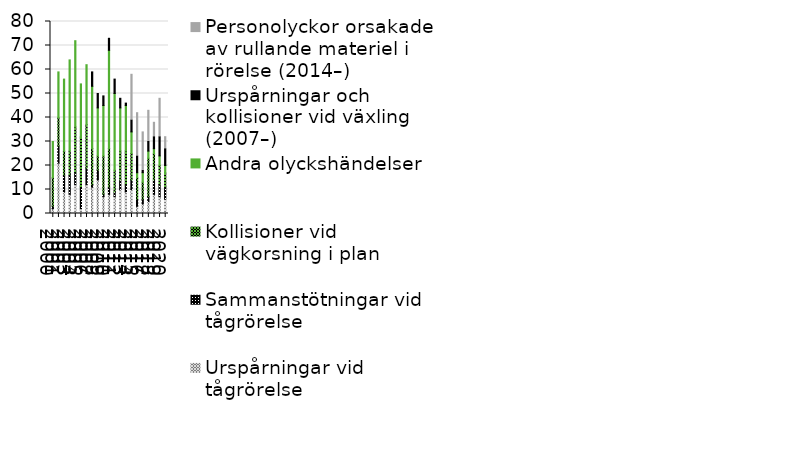
| Category | Urspårningar vid tågrörelse  | Sammanstötningar vid tågrörelse  | Kollisioner vid vägkorsning i plan | Andra olyckshändelser | Urspårningar och kollisioner vid växling  (2007–) | Personolyckor orsakade av rullande materiel i rörelse (2014–) |
|---|---|---|---|---|---|---|
| 2000 | 2 | 1 | 12 | 15 | 0 | 0 |
| 2001 | 21 | 7 | 12 | 19 | 0 | 0 |
| 2002 | 9 | 7 | 10 | 30 | 0 | 0 |
| 2003 | 8 | 8 | 10 | 38 | 0 | 0 |
| 2004 | 12 | 5 | 19 | 36 | 0 | 0 |
| 2005 | 2 | 9 | 21 | 22 | 0 | 0 |
| 2006 | 12 | 7 | 18 | 25 | 0 | 0 |
| 2007 | 11 | 1 | 15 | 26 | 6 | 0 |
| 2008 | 14 | 4 | 6 | 20 | 6 | 0 |
| 2009 | 7 | 1 | 16 | 21 | 4 | 0 |
| 2010 | 8 | 3 | 16 | 41 | 5 | 0 |
| 2011 | 7 | 2 | 9 | 32 | 6 | 0 |
| 2012 | 10 | 4 | 12 | 18 | 4 | 0 |
| 2013 | 9 | 3 | 14 | 19 | 1 | 0 |
| 2014 | 10 | 4 | 11 | 9 | 5 | 19 |
| 2015 | 3 | 3 | 9 | 2 | 7 | 18 |
| 2016 | 4 | 2 | 7 | 4 | 1 | 16 |
| 2017 | 5 | 2 | 16 | 3 | 4 | 13 |
| 2018 | 8 | 6 | 11 | 2 | 5 | 6 |
| 2019 | 7 | 5 | 8 | 4 | 8 | 16 |
| 2020 | 6 | 5 | 6 | 3 | 7 | 5 |